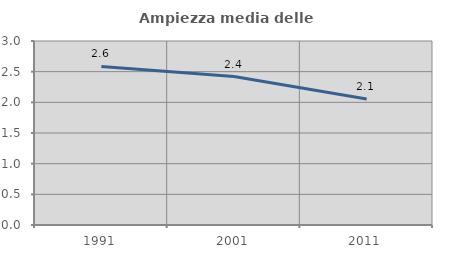
| Category | Ampiezza media delle famiglie |
|---|---|
| 1991.0 | 2.585 |
| 2001.0 | 2.421 |
| 2011.0 | 2.055 |